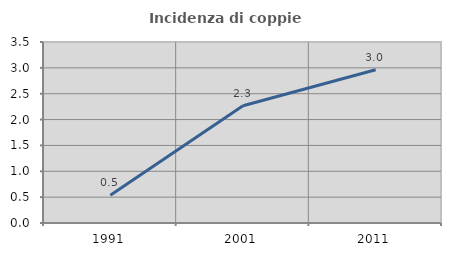
| Category | Incidenza di coppie miste |
|---|---|
| 1991.0 | 0.535 |
| 2001.0 | 2.268 |
| 2011.0 | 2.963 |